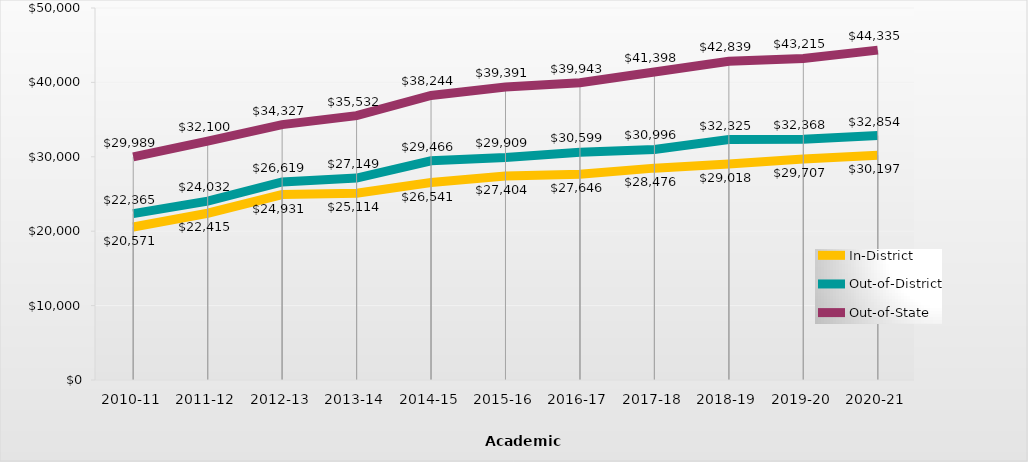
| Category | In-District | Out-of-District | Out-of-State |
|---|---|---|---|
| 2010-11 | 20571 | 22365 | 29989 |
| 2011-12 | 22415 | 24032 | 32100 |
| 2012-13 | 24931 | 26619 | 34327 |
| 2013-14 | 25114.27 | 27148.6 | 35532.25 |
| 2014-15 | 26541.34 | 29465.87 | 38243.8 |
| 2015-16 | 27404 | 29909 | 39391 |
| 2016-17 | 27646 | 30599 | 39943 |
| 2017-18 | 28476 | 30996 | 41398 |
| 2018-19 | 29018 | 32325 | 42839 |
| 2019-20 | 29707 | 32368 | 43215 |
| 2020-21 | 30197 | 32854 | 44335 |